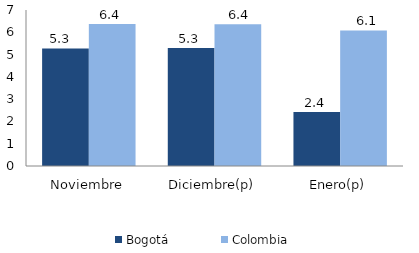
| Category | Bogotá | Colombia |
|---|---|---|
| Noviembre | 5.273 | 6.377 |
| Diciembre(p) | 5.297 | 6.364 |
| Enero(p) | 2.42 | 6.086 |